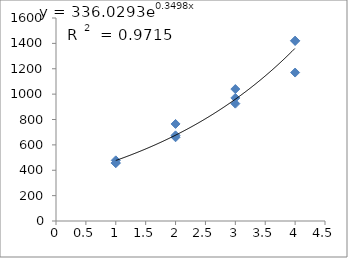
| Category | Series 0 |
|---|---|
| 1.0 | 458 |
| 1.0 | 478 |
| 1.0 | 456 |
| 2.0 | 765 |
| 2.0 | 675 |
| 2.0 | 660 |
| 3.0 | 1040 |
| 3.0 | 925 |
| 3.0 | 970 |
| 4.0 | 1170 |
| 4.0 | 1420 |
| 4.0 | 1420 |